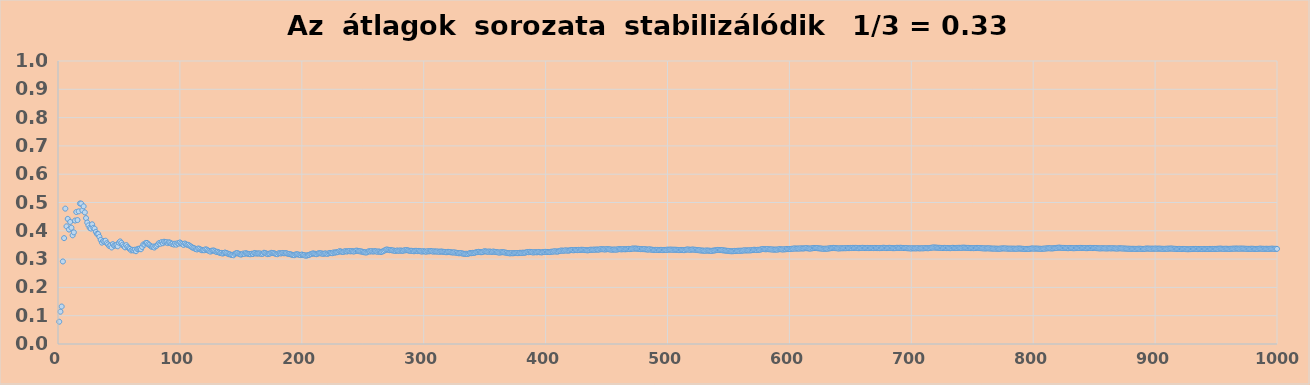
| Category | Series 0 |
|---|---|
| 1.0 | 0.079 |
| 2.0 | 0.114 |
| 3.0 | 0.132 |
| 4.0 | 0.292 |
| 5.0 | 0.374 |
| 6.0 | 0.478 |
| 7.0 | 0.416 |
| 8.0 | 0.442 |
| 9.0 | 0.404 |
| 10.0 | 0.431 |
| 11.0 | 0.411 |
| 12.0 | 0.384 |
| 13.0 | 0.394 |
| 14.0 | 0.436 |
| 15.0 | 0.466 |
| 16.0 | 0.438 |
| 17.0 | 0.469 |
| 18.0 | 0.497 |
| 19.0 | 0.496 |
| 20.0 | 0.472 |
| 21.0 | 0.486 |
| 22.0 | 0.465 |
| 23.0 | 0.445 |
| 24.0 | 0.429 |
| 25.0 | 0.419 |
| 26.0 | 0.41 |
| 27.0 | 0.408 |
| 28.0 | 0.423 |
| 29.0 | 0.41 |
| 30.0 | 0.408 |
| 31.0 | 0.396 |
| 32.0 | 0.389 |
| 33.0 | 0.389 |
| 34.0 | 0.379 |
| 35.0 | 0.368 |
| 36.0 | 0.358 |
| 37.0 | 0.364 |
| 38.0 | 0.362 |
| 39.0 | 0.365 |
| 40.0 | 0.356 |
| 41.0 | 0.352 |
| 42.0 | 0.346 |
| 43.0 | 0.348 |
| 44.0 | 0.341 |
| 45.0 | 0.353 |
| 46.0 | 0.348 |
| 47.0 | 0.348 |
| 48.0 | 0.349 |
| 49.0 | 0.345 |
| 50.0 | 0.358 |
| 51.0 | 0.362 |
| 52.0 | 0.358 |
| 53.0 | 0.351 |
| 54.0 | 0.346 |
| 55.0 | 0.341 |
| 56.0 | 0.349 |
| 57.0 | 0.343 |
| 58.0 | 0.339 |
| 59.0 | 0.336 |
| 60.0 | 0.331 |
| 61.0 | 0.333 |
| 62.0 | 0.33 |
| 63.0 | 0.333 |
| 64.0 | 0.328 |
| 65.0 | 0.335 |
| 66.0 | 0.337 |
| 67.0 | 0.337 |
| 68.0 | 0.335 |
| 69.0 | 0.343 |
| 70.0 | 0.352 |
| 71.0 | 0.351 |
| 72.0 | 0.357 |
| 73.0 | 0.357 |
| 74.0 | 0.352 |
| 75.0 | 0.35 |
| 76.0 | 0.346 |
| 77.0 | 0.343 |
| 78.0 | 0.344 |
| 79.0 | 0.341 |
| 80.0 | 0.345 |
| 81.0 | 0.347 |
| 82.0 | 0.352 |
| 83.0 | 0.357 |
| 84.0 | 0.354 |
| 85.0 | 0.36 |
| 86.0 | 0.356 |
| 87.0 | 0.361 |
| 88.0 | 0.359 |
| 89.0 | 0.36 |
| 90.0 | 0.356 |
| 91.0 | 0.359 |
| 92.0 | 0.358 |
| 93.0 | 0.354 |
| 94.0 | 0.354 |
| 95.0 | 0.351 |
| 96.0 | 0.354 |
| 97.0 | 0.351 |
| 98.0 | 0.356 |
| 99.0 | 0.355 |
| 100.0 | 0.359 |
| 101.0 | 0.355 |
| 102.0 | 0.353 |
| 103.0 | 0.35 |
| 104.0 | 0.355 |
| 105.0 | 0.353 |
| 106.0 | 0.35 |
| 107.0 | 0.35 |
| 108.0 | 0.347 |
| 109.0 | 0.345 |
| 110.0 | 0.341 |
| 111.0 | 0.339 |
| 112.0 | 0.338 |
| 113.0 | 0.335 |
| 114.0 | 0.334 |
| 115.0 | 0.337 |
| 116.0 | 0.336 |
| 117.0 | 0.334 |
| 118.0 | 0.331 |
| 119.0 | 0.332 |
| 120.0 | 0.331 |
| 121.0 | 0.334 |
| 122.0 | 0.333 |
| 123.0 | 0.331 |
| 124.0 | 0.328 |
| 125.0 | 0.326 |
| 126.0 | 0.329 |
| 127.0 | 0.33 |
| 128.0 | 0.33 |
| 129.0 | 0.328 |
| 130.0 | 0.325 |
| 131.0 | 0.326 |
| 132.0 | 0.323 |
| 133.0 | 0.322 |
| 134.0 | 0.322 |
| 135.0 | 0.319 |
| 136.0 | 0.321 |
| 137.0 | 0.323 |
| 138.0 | 0.322 |
| 139.0 | 0.32 |
| 140.0 | 0.317 |
| 141.0 | 0.317 |
| 142.0 | 0.315 |
| 143.0 | 0.315 |
| 144.0 | 0.314 |
| 145.0 | 0.318 |
| 146.0 | 0.321 |
| 147.0 | 0.321 |
| 148.0 | 0.319 |
| 149.0 | 0.318 |
| 150.0 | 0.316 |
| 151.0 | 0.317 |
| 152.0 | 0.32 |
| 153.0 | 0.318 |
| 154.0 | 0.321 |
| 155.0 | 0.319 |
| 156.0 | 0.318 |
| 157.0 | 0.317 |
| 158.0 | 0.317 |
| 159.0 | 0.319 |
| 160.0 | 0.318 |
| 161.0 | 0.322 |
| 162.0 | 0.321 |
| 163.0 | 0.319 |
| 164.0 | 0.32 |
| 165.0 | 0.32 |
| 166.0 | 0.32 |
| 167.0 | 0.318 |
| 168.0 | 0.319 |
| 169.0 | 0.322 |
| 170.0 | 0.321 |
| 171.0 | 0.319 |
| 172.0 | 0.318 |
| 173.0 | 0.319 |
| 174.0 | 0.32 |
| 175.0 | 0.322 |
| 176.0 | 0.322 |
| 177.0 | 0.321 |
| 178.0 | 0.319 |
| 179.0 | 0.318 |
| 180.0 | 0.317 |
| 181.0 | 0.321 |
| 182.0 | 0.321 |
| 183.0 | 0.32 |
| 184.0 | 0.322 |
| 185.0 | 0.321 |
| 186.0 | 0.321 |
| 187.0 | 0.321 |
| 188.0 | 0.32 |
| 189.0 | 0.318 |
| 190.0 | 0.318 |
| 191.0 | 0.317 |
| 192.0 | 0.315 |
| 193.0 | 0.314 |
| 194.0 | 0.314 |
| 195.0 | 0.317 |
| 196.0 | 0.317 |
| 197.0 | 0.316 |
| 198.0 | 0.315 |
| 199.0 | 0.314 |
| 200.0 | 0.316 |
| 201.0 | 0.315 |
| 202.0 | 0.314 |
| 203.0 | 0.312 |
| 204.0 | 0.312 |
| 205.0 | 0.314 |
| 206.0 | 0.315 |
| 207.0 | 0.317 |
| 208.0 | 0.318 |
| 209.0 | 0.32 |
| 210.0 | 0.319 |
| 211.0 | 0.319 |
| 212.0 | 0.317 |
| 213.0 | 0.319 |
| 214.0 | 0.321 |
| 215.0 | 0.321 |
| 216.0 | 0.32 |
| 217.0 | 0.319 |
| 218.0 | 0.319 |
| 219.0 | 0.32 |
| 220.0 | 0.32 |
| 221.0 | 0.318 |
| 222.0 | 0.32 |
| 223.0 | 0.322 |
| 224.0 | 0.321 |
| 225.0 | 0.321 |
| 226.0 | 0.324 |
| 227.0 | 0.323 |
| 228.0 | 0.324 |
| 229.0 | 0.324 |
| 230.0 | 0.326 |
| 231.0 | 0.328 |
| 232.0 | 0.327 |
| 233.0 | 0.326 |
| 234.0 | 0.325 |
| 235.0 | 0.327 |
| 236.0 | 0.328 |
| 237.0 | 0.327 |
| 238.0 | 0.328 |
| 239.0 | 0.328 |
| 240.0 | 0.327 |
| 241.0 | 0.328 |
| 242.0 | 0.327 |
| 243.0 | 0.327 |
| 244.0 | 0.329 |
| 245.0 | 0.33 |
| 246.0 | 0.329 |
| 247.0 | 0.328 |
| 248.0 | 0.327 |
| 249.0 | 0.327 |
| 250.0 | 0.325 |
| 251.0 | 0.324 |
| 252.0 | 0.324 |
| 253.0 | 0.323 |
| 254.0 | 0.325 |
| 255.0 | 0.328 |
| 256.0 | 0.327 |
| 257.0 | 0.328 |
| 258.0 | 0.327 |
| 259.0 | 0.327 |
| 260.0 | 0.328 |
| 261.0 | 0.327 |
| 262.0 | 0.326 |
| 263.0 | 0.327 |
| 264.0 | 0.326 |
| 265.0 | 0.325 |
| 266.0 | 0.327 |
| 267.0 | 0.328 |
| 268.0 | 0.331 |
| 269.0 | 0.333 |
| 270.0 | 0.334 |
| 271.0 | 0.333 |
| 272.0 | 0.331 |
| 273.0 | 0.332 |
| 274.0 | 0.331 |
| 275.0 | 0.331 |
| 276.0 | 0.329 |
| 277.0 | 0.329 |
| 278.0 | 0.33 |
| 279.0 | 0.33 |
| 280.0 | 0.33 |
| 281.0 | 0.331 |
| 282.0 | 0.329 |
| 283.0 | 0.329 |
| 284.0 | 0.331 |
| 285.0 | 0.331 |
| 286.0 | 0.332 |
| 287.0 | 0.331 |
| 288.0 | 0.33 |
| 289.0 | 0.329 |
| 290.0 | 0.329 |
| 291.0 | 0.329 |
| 292.0 | 0.328 |
| 293.0 | 0.329 |
| 294.0 | 0.329 |
| 295.0 | 0.328 |
| 296.0 | 0.329 |
| 297.0 | 0.328 |
| 298.0 | 0.327 |
| 299.0 | 0.327 |
| 300.0 | 0.328 |
| 301.0 | 0.327 |
| 302.0 | 0.326 |
| 303.0 | 0.328 |
| 304.0 | 0.327 |
| 305.0 | 0.328 |
| 306.0 | 0.328 |
| 307.0 | 0.327 |
| 308.0 | 0.326 |
| 309.0 | 0.327 |
| 310.0 | 0.327 |
| 311.0 | 0.327 |
| 312.0 | 0.327 |
| 313.0 | 0.326 |
| 314.0 | 0.327 |
| 315.0 | 0.326 |
| 316.0 | 0.326 |
| 317.0 | 0.325 |
| 318.0 | 0.325 |
| 319.0 | 0.324 |
| 320.0 | 0.326 |
| 321.0 | 0.325 |
| 322.0 | 0.324 |
| 323.0 | 0.324 |
| 324.0 | 0.323 |
| 325.0 | 0.324 |
| 326.0 | 0.323 |
| 327.0 | 0.322 |
| 328.0 | 0.321 |
| 329.0 | 0.32 |
| 330.0 | 0.321 |
| 331.0 | 0.321 |
| 332.0 | 0.32 |
| 333.0 | 0.319 |
| 334.0 | 0.319 |
| 335.0 | 0.319 |
| 336.0 | 0.318 |
| 337.0 | 0.32 |
| 338.0 | 0.321 |
| 339.0 | 0.321 |
| 340.0 | 0.322 |
| 341.0 | 0.322 |
| 342.0 | 0.323 |
| 343.0 | 0.324 |
| 344.0 | 0.325 |
| 345.0 | 0.326 |
| 346.0 | 0.325 |
| 347.0 | 0.324 |
| 348.0 | 0.325 |
| 349.0 | 0.326 |
| 350.0 | 0.328 |
| 351.0 | 0.327 |
| 352.0 | 0.326 |
| 353.0 | 0.326 |
| 354.0 | 0.327 |
| 355.0 | 0.326 |
| 356.0 | 0.325 |
| 357.0 | 0.327 |
| 358.0 | 0.326 |
| 359.0 | 0.325 |
| 360.0 | 0.325 |
| 361.0 | 0.324 |
| 362.0 | 0.323 |
| 363.0 | 0.323 |
| 364.0 | 0.325 |
| 365.0 | 0.324 |
| 366.0 | 0.324 |
| 367.0 | 0.323 |
| 368.0 | 0.322 |
| 369.0 | 0.321 |
| 370.0 | 0.321 |
| 371.0 | 0.32 |
| 372.0 | 0.321 |
| 373.0 | 0.32 |
| 374.0 | 0.321 |
| 375.0 | 0.321 |
| 376.0 | 0.321 |
| 377.0 | 0.321 |
| 378.0 | 0.321 |
| 379.0 | 0.322 |
| 380.0 | 0.322 |
| 381.0 | 0.323 |
| 382.0 | 0.322 |
| 383.0 | 0.323 |
| 384.0 | 0.324 |
| 385.0 | 0.325 |
| 386.0 | 0.324 |
| 387.0 | 0.325 |
| 388.0 | 0.325 |
| 389.0 | 0.324 |
| 390.0 | 0.323 |
| 391.0 | 0.324 |
| 392.0 | 0.324 |
| 393.0 | 0.324 |
| 394.0 | 0.325 |
| 395.0 | 0.324 |
| 396.0 | 0.324 |
| 397.0 | 0.324 |
| 398.0 | 0.325 |
| 399.0 | 0.325 |
| 400.0 | 0.326 |
| 401.0 | 0.325 |
| 402.0 | 0.325 |
| 403.0 | 0.325 |
| 404.0 | 0.326 |
| 405.0 | 0.326 |
| 406.0 | 0.326 |
| 407.0 | 0.328 |
| 408.0 | 0.327 |
| 409.0 | 0.327 |
| 410.0 | 0.326 |
| 411.0 | 0.328 |
| 412.0 | 0.329 |
| 413.0 | 0.33 |
| 414.0 | 0.33 |
| 415.0 | 0.329 |
| 416.0 | 0.331 |
| 417.0 | 0.33 |
| 418.0 | 0.33 |
| 419.0 | 0.33 |
| 420.0 | 0.331 |
| 421.0 | 0.332 |
| 422.0 | 0.332 |
| 423.0 | 0.331 |
| 424.0 | 0.332 |
| 425.0 | 0.332 |
| 426.0 | 0.332 |
| 427.0 | 0.333 |
| 428.0 | 0.332 |
| 429.0 | 0.333 |
| 430.0 | 0.333 |
| 431.0 | 0.333 |
| 432.0 | 0.332 |
| 433.0 | 0.332 |
| 434.0 | 0.331 |
| 435.0 | 0.331 |
| 436.0 | 0.333 |
| 437.0 | 0.333 |
| 438.0 | 0.333 |
| 439.0 | 0.333 |
| 440.0 | 0.334 |
| 441.0 | 0.333 |
| 442.0 | 0.334 |
| 443.0 | 0.333 |
| 444.0 | 0.334 |
| 445.0 | 0.335 |
| 446.0 | 0.335 |
| 447.0 | 0.335 |
| 448.0 | 0.334 |
| 449.0 | 0.334 |
| 450.0 | 0.335 |
| 451.0 | 0.335 |
| 452.0 | 0.335 |
| 453.0 | 0.334 |
| 454.0 | 0.334 |
| 455.0 | 0.333 |
| 456.0 | 0.334 |
| 457.0 | 0.333 |
| 458.0 | 0.334 |
| 459.0 | 0.334 |
| 460.0 | 0.335 |
| 461.0 | 0.335 |
| 462.0 | 0.334 |
| 463.0 | 0.335 |
| 464.0 | 0.335 |
| 465.0 | 0.335 |
| 466.0 | 0.335 |
| 467.0 | 0.335 |
| 468.0 | 0.336 |
| 469.0 | 0.335 |
| 470.0 | 0.336 |
| 471.0 | 0.337 |
| 472.0 | 0.337 |
| 473.0 | 0.337 |
| 474.0 | 0.337 |
| 475.0 | 0.337 |
| 476.0 | 0.336 |
| 477.0 | 0.336 |
| 478.0 | 0.335 |
| 479.0 | 0.336 |
| 480.0 | 0.335 |
| 481.0 | 0.335 |
| 482.0 | 0.335 |
| 483.0 | 0.334 |
| 484.0 | 0.334 |
| 485.0 | 0.335 |
| 486.0 | 0.334 |
| 487.0 | 0.333 |
| 488.0 | 0.333 |
| 489.0 | 0.332 |
| 490.0 | 0.333 |
| 491.0 | 0.332 |
| 492.0 | 0.333 |
| 493.0 | 0.332 |
| 494.0 | 0.333 |
| 495.0 | 0.332 |
| 496.0 | 0.332 |
| 497.0 | 0.332 |
| 498.0 | 0.333 |
| 499.0 | 0.333 |
| 500.0 | 0.333 |
| 501.0 | 0.333 |
| 502.0 | 0.334 |
| 503.0 | 0.333 |
| 504.0 | 0.333 |
| 505.0 | 0.333 |
| 506.0 | 0.333 |
| 507.0 | 0.333 |
| 508.0 | 0.333 |
| 509.0 | 0.332 |
| 510.0 | 0.332 |
| 511.0 | 0.332 |
| 512.0 | 0.332 |
| 513.0 | 0.332 |
| 514.0 | 0.332 |
| 515.0 | 0.333 |
| 516.0 | 0.334 |
| 517.0 | 0.334 |
| 518.0 | 0.333 |
| 519.0 | 0.333 |
| 520.0 | 0.334 |
| 521.0 | 0.334 |
| 522.0 | 0.333 |
| 523.0 | 0.333 |
| 524.0 | 0.332 |
| 525.0 | 0.332 |
| 526.0 | 0.331 |
| 527.0 | 0.331 |
| 528.0 | 0.33 |
| 529.0 | 0.33 |
| 530.0 | 0.33 |
| 531.0 | 0.33 |
| 532.0 | 0.331 |
| 533.0 | 0.33 |
| 534.0 | 0.33 |
| 535.0 | 0.329 |
| 536.0 | 0.329 |
| 537.0 | 0.33 |
| 538.0 | 0.33 |
| 539.0 | 0.331 |
| 540.0 | 0.332 |
| 541.0 | 0.332 |
| 542.0 | 0.332 |
| 543.0 | 0.332 |
| 544.0 | 0.332 |
| 545.0 | 0.331 |
| 546.0 | 0.331 |
| 547.0 | 0.33 |
| 548.0 | 0.33 |
| 549.0 | 0.329 |
| 550.0 | 0.329 |
| 551.0 | 0.328 |
| 552.0 | 0.328 |
| 553.0 | 0.328 |
| 554.0 | 0.328 |
| 555.0 | 0.329 |
| 556.0 | 0.328 |
| 557.0 | 0.329 |
| 558.0 | 0.329 |
| 559.0 | 0.329 |
| 560.0 | 0.33 |
| 561.0 | 0.329 |
| 562.0 | 0.33 |
| 563.0 | 0.331 |
| 564.0 | 0.33 |
| 565.0 | 0.331 |
| 566.0 | 0.331 |
| 567.0 | 0.331 |
| 568.0 | 0.331 |
| 569.0 | 0.332 |
| 570.0 | 0.332 |
| 571.0 | 0.333 |
| 572.0 | 0.333 |
| 573.0 | 0.332 |
| 574.0 | 0.333 |
| 575.0 | 0.333 |
| 576.0 | 0.334 |
| 577.0 | 0.335 |
| 578.0 | 0.336 |
| 579.0 | 0.335 |
| 580.0 | 0.335 |
| 581.0 | 0.335 |
| 582.0 | 0.335 |
| 583.0 | 0.335 |
| 584.0 | 0.335 |
| 585.0 | 0.334 |
| 586.0 | 0.334 |
| 587.0 | 0.334 |
| 588.0 | 0.333 |
| 589.0 | 0.334 |
| 590.0 | 0.333 |
| 591.0 | 0.334 |
| 592.0 | 0.335 |
| 593.0 | 0.335 |
| 594.0 | 0.334 |
| 595.0 | 0.334 |
| 596.0 | 0.335 |
| 597.0 | 0.335 |
| 598.0 | 0.336 |
| 599.0 | 0.335 |
| 600.0 | 0.336 |
| 601.0 | 0.336 |
| 602.0 | 0.337 |
| 603.0 | 0.337 |
| 604.0 | 0.338 |
| 605.0 | 0.337 |
| 606.0 | 0.337 |
| 607.0 | 0.337 |
| 608.0 | 0.337 |
| 609.0 | 0.338 |
| 610.0 | 0.338 |
| 611.0 | 0.338 |
| 612.0 | 0.338 |
| 613.0 | 0.339 |
| 614.0 | 0.339 |
| 615.0 | 0.338 |
| 616.0 | 0.338 |
| 617.0 | 0.337 |
| 618.0 | 0.338 |
| 619.0 | 0.338 |
| 620.0 | 0.339 |
| 621.0 | 0.339 |
| 622.0 | 0.339 |
| 623.0 | 0.339 |
| 624.0 | 0.338 |
| 625.0 | 0.338 |
| 626.0 | 0.337 |
| 627.0 | 0.337 |
| 628.0 | 0.336 |
| 629.0 | 0.337 |
| 630.0 | 0.337 |
| 631.0 | 0.337 |
| 632.0 | 0.337 |
| 633.0 | 0.338 |
| 634.0 | 0.339 |
| 635.0 | 0.339 |
| 636.0 | 0.34 |
| 637.0 | 0.339 |
| 638.0 | 0.339 |
| 639.0 | 0.338 |
| 640.0 | 0.338 |
| 641.0 | 0.338 |
| 642.0 | 0.338 |
| 643.0 | 0.338 |
| 644.0 | 0.338 |
| 645.0 | 0.339 |
| 646.0 | 0.338 |
| 647.0 | 0.339 |
| 648.0 | 0.339 |
| 649.0 | 0.339 |
| 650.0 | 0.34 |
| 651.0 | 0.339 |
| 652.0 | 0.34 |
| 653.0 | 0.339 |
| 654.0 | 0.34 |
| 655.0 | 0.339 |
| 656.0 | 0.339 |
| 657.0 | 0.338 |
| 658.0 | 0.339 |
| 659.0 | 0.339 |
| 660.0 | 0.34 |
| 661.0 | 0.339 |
| 662.0 | 0.339 |
| 663.0 | 0.339 |
| 664.0 | 0.339 |
| 665.0 | 0.339 |
| 666.0 | 0.339 |
| 667.0 | 0.339 |
| 668.0 | 0.339 |
| 669.0 | 0.339 |
| 670.0 | 0.339 |
| 671.0 | 0.339 |
| 672.0 | 0.339 |
| 673.0 | 0.339 |
| 674.0 | 0.339 |
| 675.0 | 0.339 |
| 676.0 | 0.339 |
| 677.0 | 0.34 |
| 678.0 | 0.34 |
| 679.0 | 0.339 |
| 680.0 | 0.339 |
| 681.0 | 0.34 |
| 682.0 | 0.34 |
| 683.0 | 0.339 |
| 684.0 | 0.339 |
| 685.0 | 0.339 |
| 686.0 | 0.339 |
| 687.0 | 0.339 |
| 688.0 | 0.34 |
| 689.0 | 0.34 |
| 690.0 | 0.339 |
| 691.0 | 0.34 |
| 692.0 | 0.34 |
| 693.0 | 0.339 |
| 694.0 | 0.339 |
| 695.0 | 0.339 |
| 696.0 | 0.339 |
| 697.0 | 0.338 |
| 698.0 | 0.338 |
| 699.0 | 0.338 |
| 700.0 | 0.337 |
| 701.0 | 0.338 |
| 702.0 | 0.338 |
| 703.0 | 0.338 |
| 704.0 | 0.338 |
| 705.0 | 0.338 |
| 706.0 | 0.338 |
| 707.0 | 0.338 |
| 708.0 | 0.338 |
| 709.0 | 0.338 |
| 710.0 | 0.338 |
| 711.0 | 0.339 |
| 712.0 | 0.339 |
| 713.0 | 0.339 |
| 714.0 | 0.338 |
| 715.0 | 0.339 |
| 716.0 | 0.34 |
| 717.0 | 0.341 |
| 718.0 | 0.341 |
| 719.0 | 0.341 |
| 720.0 | 0.341 |
| 721.0 | 0.34 |
| 722.0 | 0.34 |
| 723.0 | 0.34 |
| 724.0 | 0.339 |
| 725.0 | 0.339 |
| 726.0 | 0.339 |
| 727.0 | 0.34 |
| 728.0 | 0.339 |
| 729.0 | 0.339 |
| 730.0 | 0.339 |
| 731.0 | 0.339 |
| 732.0 | 0.339 |
| 733.0 | 0.339 |
| 734.0 | 0.34 |
| 735.0 | 0.34 |
| 736.0 | 0.339 |
| 737.0 | 0.34 |
| 738.0 | 0.34 |
| 739.0 | 0.34 |
| 740.0 | 0.34 |
| 741.0 | 0.34 |
| 742.0 | 0.34 |
| 743.0 | 0.34 |
| 744.0 | 0.34 |
| 745.0 | 0.34 |
| 746.0 | 0.34 |
| 747.0 | 0.34 |
| 748.0 | 0.339 |
| 749.0 | 0.339 |
| 750.0 | 0.339 |
| 751.0 | 0.339 |
| 752.0 | 0.339 |
| 753.0 | 0.339 |
| 754.0 | 0.34 |
| 755.0 | 0.339 |
| 756.0 | 0.339 |
| 757.0 | 0.339 |
| 758.0 | 0.338 |
| 759.0 | 0.338 |
| 760.0 | 0.338 |
| 761.0 | 0.338 |
| 762.0 | 0.338 |
| 763.0 | 0.338 |
| 764.0 | 0.338 |
| 765.0 | 0.338 |
| 766.0 | 0.337 |
| 767.0 | 0.337 |
| 768.0 | 0.337 |
| 769.0 | 0.337 |
| 770.0 | 0.337 |
| 771.0 | 0.337 |
| 772.0 | 0.336 |
| 773.0 | 0.337 |
| 774.0 | 0.337 |
| 775.0 | 0.338 |
| 776.0 | 0.338 |
| 777.0 | 0.338 |
| 778.0 | 0.337 |
| 779.0 | 0.337 |
| 780.0 | 0.337 |
| 781.0 | 0.337 |
| 782.0 | 0.337 |
| 783.0 | 0.337 |
| 784.0 | 0.337 |
| 785.0 | 0.337 |
| 786.0 | 0.336 |
| 787.0 | 0.337 |
| 788.0 | 0.337 |
| 789.0 | 0.337 |
| 790.0 | 0.337 |
| 791.0 | 0.336 |
| 792.0 | 0.336 |
| 793.0 | 0.336 |
| 794.0 | 0.336 |
| 795.0 | 0.336 |
| 796.0 | 0.336 |
| 797.0 | 0.336 |
| 798.0 | 0.337 |
| 799.0 | 0.337 |
| 800.0 | 0.337 |
| 801.0 | 0.337 |
| 802.0 | 0.337 |
| 803.0 | 0.337 |
| 804.0 | 0.337 |
| 805.0 | 0.337 |
| 806.0 | 0.336 |
| 807.0 | 0.336 |
| 808.0 | 0.337 |
| 809.0 | 0.337 |
| 810.0 | 0.337 |
| 811.0 | 0.338 |
| 812.0 | 0.338 |
| 813.0 | 0.338 |
| 814.0 | 0.338 |
| 815.0 | 0.338 |
| 816.0 | 0.338 |
| 817.0 | 0.339 |
| 818.0 | 0.339 |
| 819.0 | 0.34 |
| 820.0 | 0.34 |
| 821.0 | 0.341 |
| 822.0 | 0.34 |
| 823.0 | 0.34 |
| 824.0 | 0.339 |
| 825.0 | 0.34 |
| 826.0 | 0.339 |
| 827.0 | 0.339 |
| 828.0 | 0.339 |
| 829.0 | 0.339 |
| 830.0 | 0.339 |
| 831.0 | 0.339 |
| 832.0 | 0.339 |
| 833.0 | 0.338 |
| 834.0 | 0.338 |
| 835.0 | 0.339 |
| 836.0 | 0.339 |
| 837.0 | 0.339 |
| 838.0 | 0.339 |
| 839.0 | 0.34 |
| 840.0 | 0.339 |
| 841.0 | 0.339 |
| 842.0 | 0.339 |
| 843.0 | 0.339 |
| 844.0 | 0.338 |
| 845.0 | 0.339 |
| 846.0 | 0.339 |
| 847.0 | 0.339 |
| 848.0 | 0.339 |
| 849.0 | 0.339 |
| 850.0 | 0.339 |
| 851.0 | 0.339 |
| 852.0 | 0.339 |
| 853.0 | 0.338 |
| 854.0 | 0.338 |
| 855.0 | 0.338 |
| 856.0 | 0.338 |
| 857.0 | 0.338 |
| 858.0 | 0.338 |
| 859.0 | 0.338 |
| 860.0 | 0.338 |
| 861.0 | 0.338 |
| 862.0 | 0.338 |
| 863.0 | 0.338 |
| 864.0 | 0.338 |
| 865.0 | 0.338 |
| 866.0 | 0.338 |
| 867.0 | 0.338 |
| 868.0 | 0.337 |
| 869.0 | 0.337 |
| 870.0 | 0.338 |
| 871.0 | 0.338 |
| 872.0 | 0.338 |
| 873.0 | 0.338 |
| 874.0 | 0.337 |
| 875.0 | 0.337 |
| 876.0 | 0.337 |
| 877.0 | 0.337 |
| 878.0 | 0.337 |
| 879.0 | 0.337 |
| 880.0 | 0.336 |
| 881.0 | 0.336 |
| 882.0 | 0.336 |
| 883.0 | 0.336 |
| 884.0 | 0.336 |
| 885.0 | 0.336 |
| 886.0 | 0.337 |
| 887.0 | 0.337 |
| 888.0 | 0.337 |
| 889.0 | 0.336 |
| 890.0 | 0.336 |
| 891.0 | 0.336 |
| 892.0 | 0.337 |
| 893.0 | 0.337 |
| 894.0 | 0.337 |
| 895.0 | 0.337 |
| 896.0 | 0.337 |
| 897.0 | 0.337 |
| 898.0 | 0.337 |
| 899.0 | 0.337 |
| 900.0 | 0.337 |
| 901.0 | 0.337 |
| 902.0 | 0.337 |
| 903.0 | 0.337 |
| 904.0 | 0.337 |
| 905.0 | 0.337 |
| 906.0 | 0.336 |
| 907.0 | 0.336 |
| 908.0 | 0.336 |
| 909.0 | 0.337 |
| 910.0 | 0.337 |
| 911.0 | 0.337 |
| 912.0 | 0.337 |
| 913.0 | 0.337 |
| 914.0 | 0.337 |
| 915.0 | 0.337 |
| 916.0 | 0.336 |
| 917.0 | 0.336 |
| 918.0 | 0.336 |
| 919.0 | 0.336 |
| 920.0 | 0.336 |
| 921.0 | 0.336 |
| 922.0 | 0.336 |
| 923.0 | 0.336 |
| 924.0 | 0.336 |
| 925.0 | 0.335 |
| 926.0 | 0.335 |
| 927.0 | 0.335 |
| 928.0 | 0.335 |
| 929.0 | 0.335 |
| 930.0 | 0.336 |
| 931.0 | 0.336 |
| 932.0 | 0.336 |
| 933.0 | 0.336 |
| 934.0 | 0.336 |
| 935.0 | 0.335 |
| 936.0 | 0.336 |
| 937.0 | 0.336 |
| 938.0 | 0.336 |
| 939.0 | 0.335 |
| 940.0 | 0.336 |
| 941.0 | 0.336 |
| 942.0 | 0.336 |
| 943.0 | 0.336 |
| 944.0 | 0.336 |
| 945.0 | 0.336 |
| 946.0 | 0.336 |
| 947.0 | 0.336 |
| 948.0 | 0.336 |
| 949.0 | 0.336 |
| 950.0 | 0.336 |
| 951.0 | 0.336 |
| 952.0 | 0.336 |
| 953.0 | 0.337 |
| 954.0 | 0.337 |
| 955.0 | 0.337 |
| 956.0 | 0.336 |
| 957.0 | 0.336 |
| 958.0 | 0.337 |
| 959.0 | 0.337 |
| 960.0 | 0.336 |
| 961.0 | 0.336 |
| 962.0 | 0.336 |
| 963.0 | 0.337 |
| 964.0 | 0.337 |
| 965.0 | 0.337 |
| 966.0 | 0.337 |
| 967.0 | 0.337 |
| 968.0 | 0.337 |
| 969.0 | 0.337 |
| 970.0 | 0.337 |
| 971.0 | 0.337 |
| 972.0 | 0.337 |
| 973.0 | 0.337 |
| 974.0 | 0.337 |
| 975.0 | 0.336 |
| 976.0 | 0.336 |
| 977.0 | 0.336 |
| 978.0 | 0.336 |
| 979.0 | 0.337 |
| 980.0 | 0.337 |
| 981.0 | 0.336 |
| 982.0 | 0.336 |
| 983.0 | 0.336 |
| 984.0 | 0.336 |
| 985.0 | 0.336 |
| 986.0 | 0.337 |
| 987.0 | 0.337 |
| 988.0 | 0.337 |
| 989.0 | 0.336 |
| 990.0 | 0.336 |
| 991.0 | 0.337 |
| 992.0 | 0.336 |
| 993.0 | 0.336 |
| 994.0 | 0.336 |
| 995.0 | 0.337 |
| 996.0 | 0.337 |
| 997.0 | 0.337 |
| 998.0 | 0.336 |
| 999.0 | 0.336 |
| 1000.0 | 0.336 |